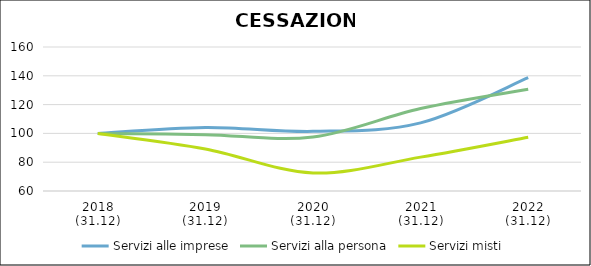
| Category | Servizi alle imprese | Servizi alla persona | Servizi misti |
|---|---|---|---|
| 2018
(31.12) | 100 | 100 | 100 |
| 2019
(31.12) | 104.153 | 99.133 | 89.233 |
| 2020
(31.12) | 101.417 | 97.469 | 72.512 |
| 2021
(31.12) | 107.324 | 117.236 | 83.523 |
| 2022
(31.12) | 138.652 | 130.629 | 97.334 |